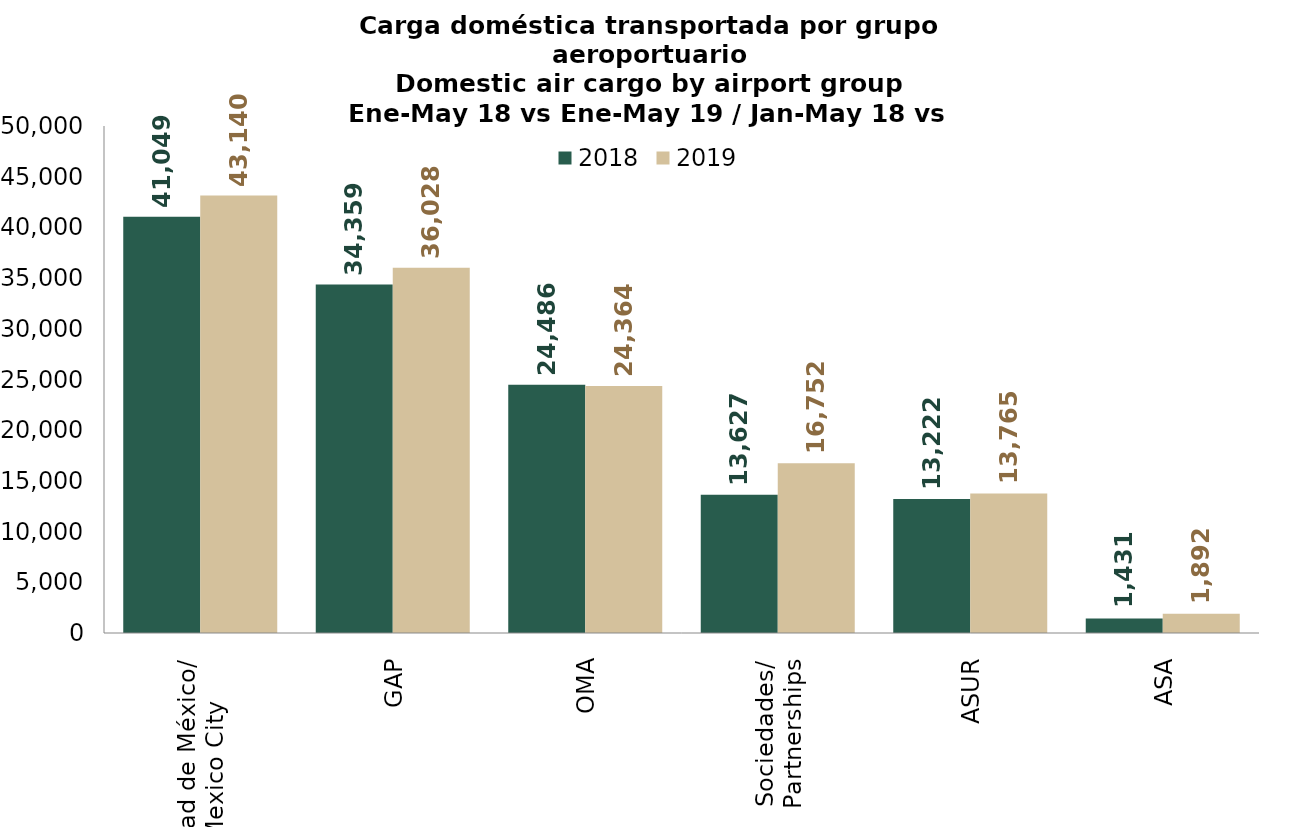
| Category | 2018 | 2019 |
|---|---|---|
| Ciudad de México/
Mexico City | 41049.05 | 43139.99 |
| GAP | 34359.058 | 36027.867 |
| OMA | 24486.442 | 24364.203 |
| Sociedades/
Partnerships | 13627.053 | 16752.147 |
| ASUR | 13221.764 | 13764.856 |
| ASA | 1431.188 | 1892.283 |